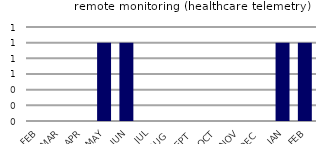
| Category | remote monitoring (healthcare telemetry) |
|---|---|
| FEB | 0 |
| MAR | 0 |
| APR | 0 |
| MAY | 1 |
| JUN | 1 |
| JUL | 0 |
| AUG | 0 |
| SEPT | 0 |
| OCT | 0 |
| NOV | 0 |
| DEC | 0 |
| JAN | 1 |
| FEB | 1 |